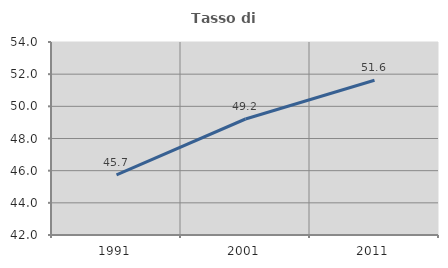
| Category | Tasso di occupazione   |
|---|---|
| 1991.0 | 45.744 |
| 2001.0 | 49.212 |
| 2011.0 | 51.625 |